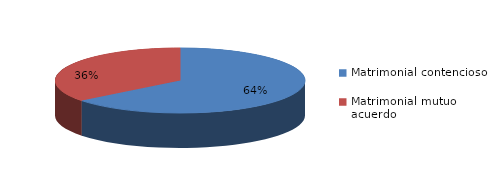
| Category | Series 0 |
|---|---|
| 0 | 822 |
| 1 | 455 |